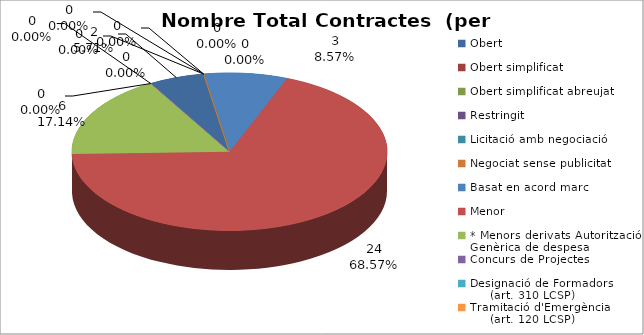
| Category | Nombre Total Contractes |
|---|---|
| Obert | 2 |
| Obert simplificat | 0 |
| Obert simplificat abreujat | 0 |
| Restringit | 0 |
| Licitació amb negociació | 0 |
| Negociat sense publicitat | 0 |
| Basat en acord marc | 3 |
| Menor | 24 |
| * Menors derivats Autorització Genèrica de despesa | 6 |
| Concurs de Projectes | 0 |
| Designació de Formadors
     (art. 310 LCSP) | 0 |
| Tramitació d'Emergència
     (art. 120 LCSP) | 0 |